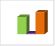
| Category | област Русе |
|---|---|
| летен сезон 2019  | 69537 |
| летен сезон 2021  | 63294 |
| летен сезон 2022 г.  | 71271 |